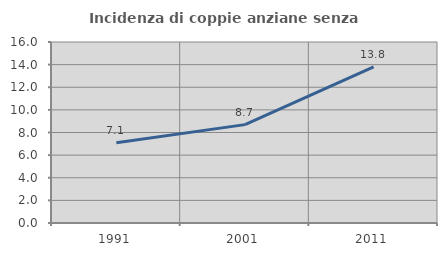
| Category | Incidenza di coppie anziane senza figli  |
|---|---|
| 1991.0 | 7.095 |
| 2001.0 | 8.696 |
| 2011.0 | 13.793 |